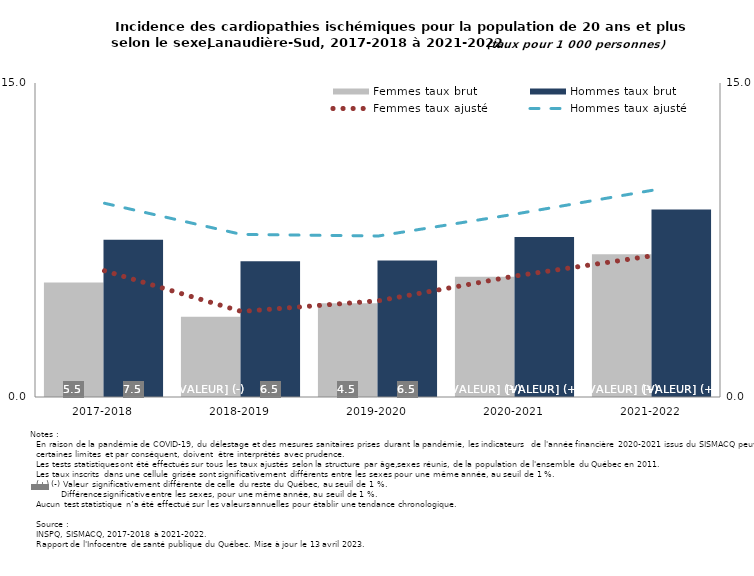
| Category | Femmes taux brut | Hommes taux brut |
|---|---|---|
| 2017-2018 | 5.472 | 7.517 |
| 2018-2019 | 3.838 | 6.488 |
| 2019-2020 | 4.482 | 6.515 |
| 2020-2021 | 5.745 | 7.642 |
| 2021-2022 | 6.819 | 8.962 |